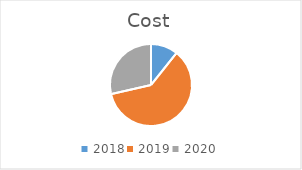
| Category | Cost |
|---|---|
| 2018.0 | 3 |
| 2019.0 | 17 |
| 2020.0 | 8 |